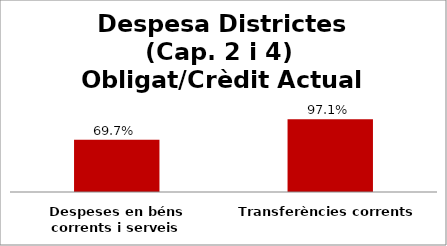
| Category | Series 0 |
|---|---|
| Despeses en béns corrents i serveis | 0.697 |
| Transferències corrents | 0.971 |